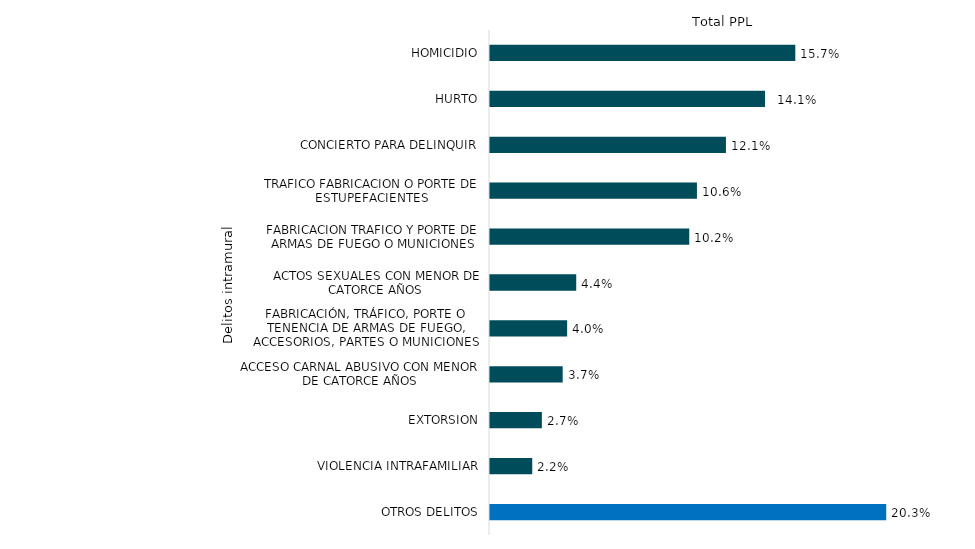
| Category | Total |
|---|---|
| HOMICIDIO | 25874 |
| HURTO | 23309 |
| CONCIERTO PARA DELINQUIR | 19995 |
| TRAFICO FABRICACION O PORTE DE ESTUPEFACIENTES | 17538 |
| FABRICACION TRAFICO Y PORTE DE ARMAS DE FUEGO O MUNICIONES | 16887 |
| ACTOS SEXUALES CON MENOR DE CATORCE AÑOS | 7308 |
| FABRICACIÓN, TRÁFICO, PORTE O TENENCIA DE ARMAS DE FUEGO, ACCESORIOS, PARTES O MUNICIONES | 6538 |
| ACCESO CARNAL ABUSIVO CON MENOR DE CATORCE AÑOS | 6160 |
| EXTORSION | 4396 |
| VIOLENCIA INTRAFAMILIAR | 3581 |
| OTROS DELITOS | 33577 |